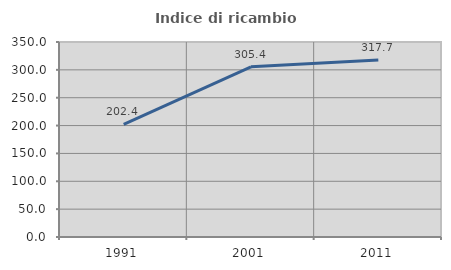
| Category | Indice di ricambio occupazionale  |
|---|---|
| 1991.0 | 202.353 |
| 2001.0 | 305.426 |
| 2011.0 | 317.73 |